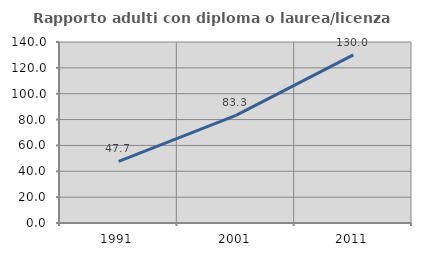
| Category | Rapporto adulti con diploma o laurea/licenza media  |
|---|---|
| 1991.0 | 47.706 |
| 2001.0 | 83.267 |
| 2011.0 | 130.018 |